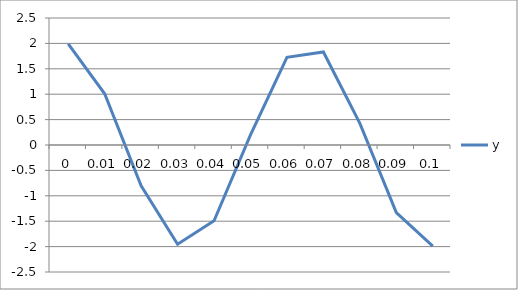
| Category | y |
|---|---|
| 0.0 | 1.99 |
| 0.01 | 1.008 |
| 0.02 | -0.805 |
| 0.03 | -1.954 |
| 0.04 | -1.493 |
| 0.05 | 0.2 |
| 0.060000000000000005 | 1.727 |
| 0.07 | 1.831 |
| 0.08 | 0.425 |
| 0.09 | -1.331 |
| 0.09999999999999999 | -1.99 |